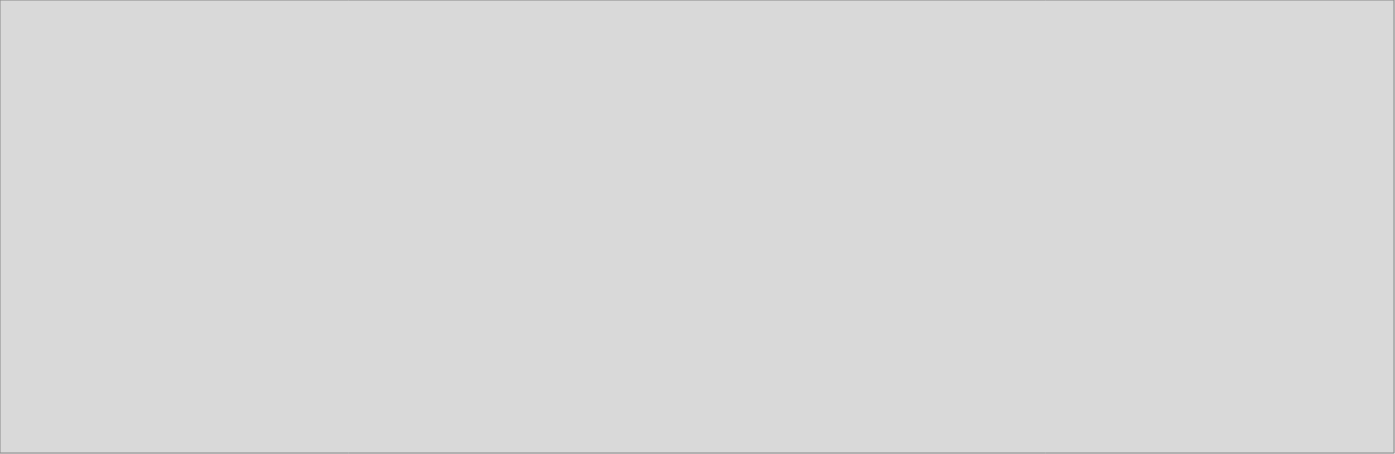
| Category | Hogares privados con servicio doméstico |
|---|---|
| 2018_I | 1354.977 |
| 2018_II | 1318.56 |
| 2018_III | 1312.13 |
| 2018_IV | 1363.597 |
| 2019_I | 1443.298 |
| 2019_II | 1426.563 |
| 2019_III | 0 |
| 2019_IV | 0 |